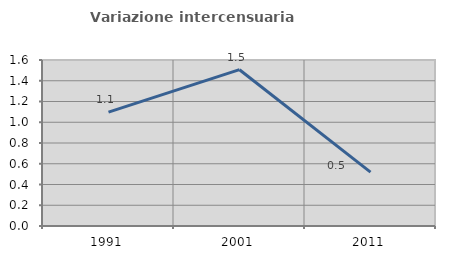
| Category | Variazione intercensuaria annua |
|---|---|
| 1991.0 | 1.098 |
| 2001.0 | 1.507 |
| 2011.0 | 0.519 |